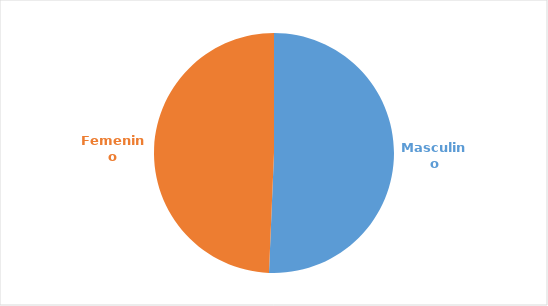
| Category | Series 0 |
|---|---|
| Masculino | 0.507 |
| Femenino | 0.493 |